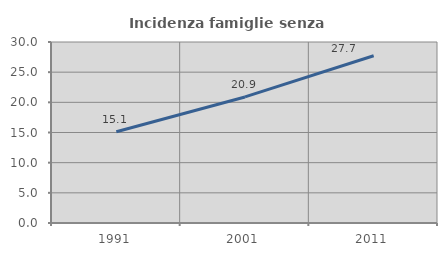
| Category | Incidenza famiglie senza nuclei |
|---|---|
| 1991.0 | 15.133 |
| 2001.0 | 20.893 |
| 2011.0 | 27.718 |